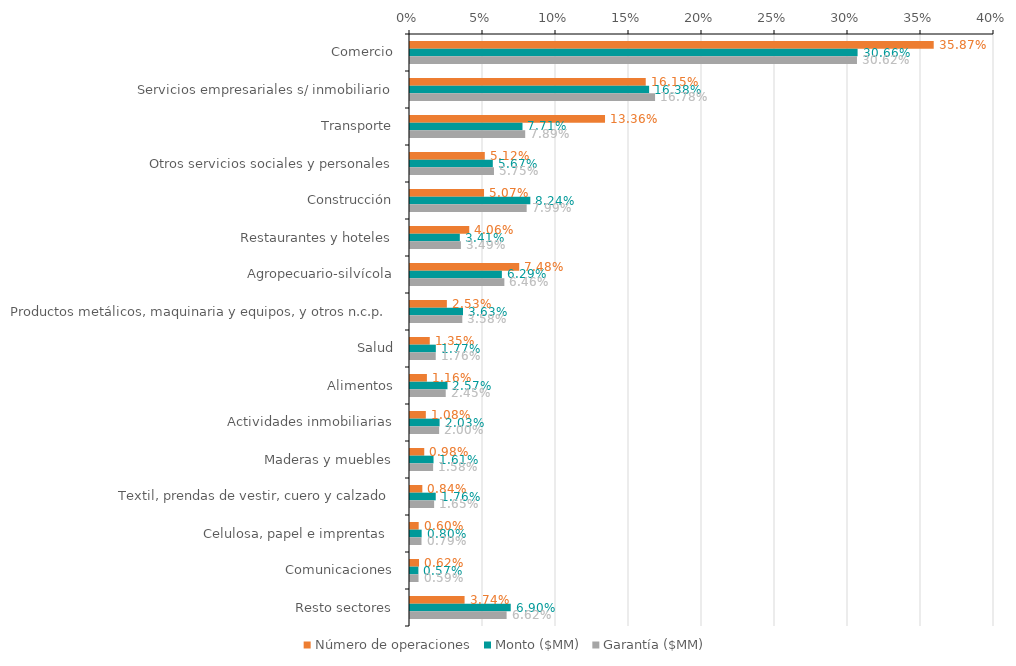
| Category | Número de operaciones | Monto ($MM) | Garantía ($MM) |
|---|---|---|---|
| Comercio | 0.359 | 0.307 | 0.306 |
| Servicios empresariales s/ inmobiliario | 0.161 | 0.164 | 0.168 |
| Transporte | 0.134 | 0.077 | 0.079 |
| Otros servicios sociales y personales | 0.051 | 0.057 | 0.058 |
| Construcción | 0.051 | 0.082 | 0.08 |
| Restaurantes y hoteles | 0.041 | 0.034 | 0.035 |
| Agropecuario-silvícola | 0.075 | 0.063 | 0.065 |
| Productos metálicos, maquinaria y equipos, y otros n.c.p. | 0.025 | 0.036 | 0.036 |
| Salud | 0.014 | 0.018 | 0.018 |
| Alimentos | 0.012 | 0.026 | 0.024 |
| Actividades inmobiliarias | 0.011 | 0.02 | 0.02 |
| Maderas y muebles | 0.01 | 0.016 | 0.016 |
| Textil, prendas de vestir, cuero y calzado | 0.008 | 0.018 | 0.017 |
| Celulosa, papel e imprentas  | 0.006 | 0.008 | 0.008 |
| Comunicaciones | 0.006 | 0.006 | 0.006 |
| Resto sectores | 0.037 | 0.069 | 0.066 |